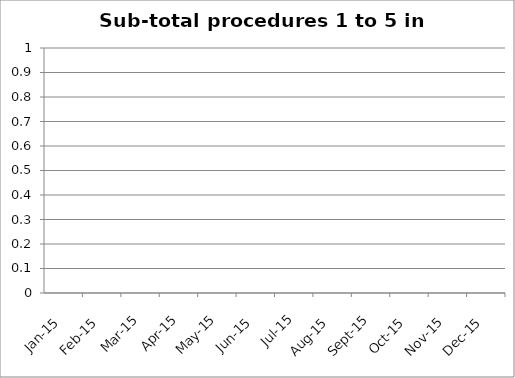
| Category | Series 0 |
|---|---|
| 2015-01-01 | 0 |
| 2015-02-01 | 0 |
| 2015-03-01 | 0 |
| 2015-04-01 | 0 |
| 2015-05-01 | 0 |
| 2015-06-01 | 0 |
| 2015-07-01 | 0 |
| 2015-08-01 | 0 |
| 2015-09-01 | 0 |
| 2015-10-01 | 0 |
| 2015-11-01 | 0 |
| 2015-12-01 | 0 |